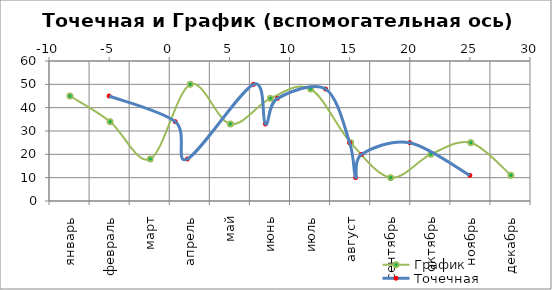
| Category | График |
|---|---|
| январь | 45 |
| февраль | 34 |
| март | 18 |
| апрель | 50 |
| май | 33 |
| июнь | 44 |
| июль | 48 |
| август | 25 |
| сентябрь | 10 |
| октябрь | 20 |
| ноябрь | 25 |
| декабрь | 11 |